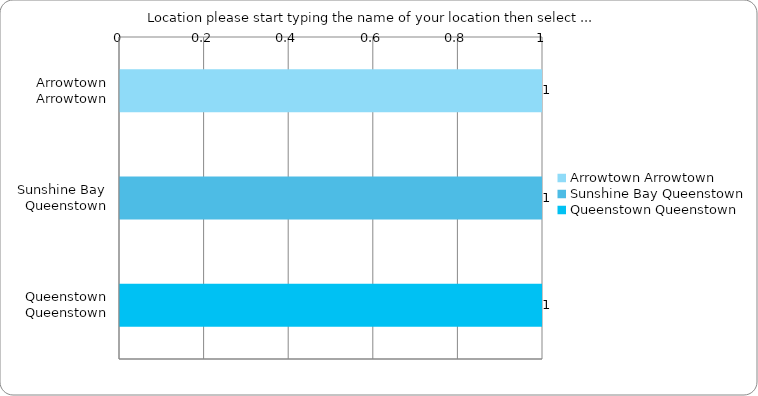
| Category | Series 0 |
|---|---|
| Arrowtown Arrowtown | 1 |
| Sunshine Bay Queenstown | 1 |
| Queenstown Queenstown | 1 |